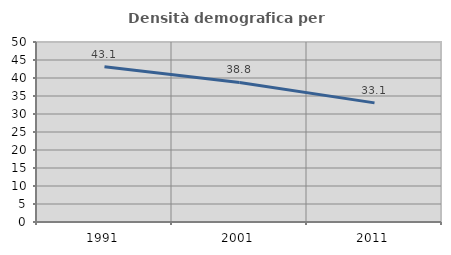
| Category | Densità demografica |
|---|---|
| 1991.0 | 43.128 |
| 2001.0 | 38.752 |
| 2011.0 | 33.088 |